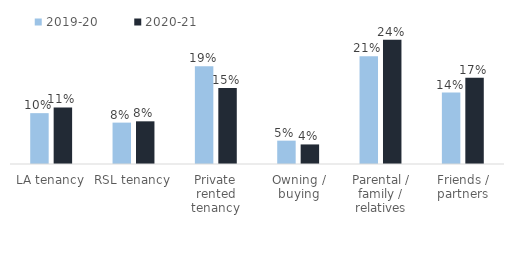
| Category | 2019-20 | 2020-21 |
|---|---|---|
| LA tenancy | 0.099 | 0.11 |
| RSL tenancy | 0.081 | 0.083 |
| Private rented tenancy | 0.19 | 0.148 |
| Owning / buying | 0.045 | 0.038 |
| Parental / family / relatives | 0.21 | 0.242 |
| Friends / partners | 0.139 | 0.168 |